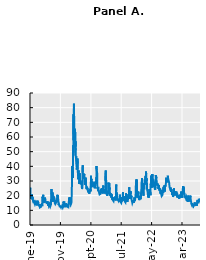
| Category | 25.42 |
|---|---|
| 2019-01-02 | 23.22 |
| 2019-01-03 | 25.45 |
| 2019-01-04 | 21.38 |
| 2019-01-07 | 21.4 |
| 2019-01-08 | 20.47 |
| 2019-01-09 | 19.98 |
| 2019-01-10 | 19.5 |
| 2019-01-11 | 18.19 |
| 2019-01-14 | 19.07 |
| 2019-01-15 | 18.6 |
| 2019-01-16 | 19.04 |
| 2019-01-17 | 18.06 |
| 2019-01-18 | 17.8 |
| 2019-01-21 | 17.8 |
| 2019-01-22 | 20.8 |
| 2019-01-23 | 19.52 |
| 2019-01-24 | 18.89 |
| 2019-01-25 | 17.42 |
| 2019-01-28 | 18.87 |
| 2019-01-29 | 19.13 |
| 2019-01-30 | 17.66 |
| 2019-01-31 | 16.57 |
| 2019-02-01 | 16.14 |
| 2019-02-04 | 15.73 |
| 2019-02-05 | 15.57 |
| 2019-02-06 | 15.38 |
| 2019-02-07 | 16.37 |
| 2019-02-08 | 15.72 |
| 2019-02-11 | 15.97 |
| 2019-02-12 | 15.43 |
| 2019-02-13 | 15.65 |
| 2019-02-14 | 16.22 |
| 2019-02-15 | 14.91 |
| 2019-02-18 | 14.91 |
| 2019-02-19 | 14.88 |
| 2019-02-20 | 14.02 |
| 2019-02-21 | 14.46 |
| 2019-02-22 | 13.51 |
| 2019-02-25 | 14.85 |
| 2019-02-26 | 15.17 |
| 2019-02-27 | 14.7 |
| 2019-02-28 | 14.78 |
| 2019-03-01 | 13.57 |
| 2019-03-04 | 14.63 |
| 2019-03-05 | 14.74 |
| 2019-03-06 | 15.74 |
| 2019-03-07 | 16.59 |
| 2019-03-08 | 16.05 |
| 2019-03-11 | 14.33 |
| 2019-03-12 | 13.77 |
| 2019-03-13 | 13.41 |
| 2019-03-14 | 13.5 |
| 2019-03-15 | 12.88 |
| 2019-03-18 | 13.1 |
| 2019-03-19 | 13.56 |
| 2019-03-20 | 13.91 |
| 2019-03-21 | 13.63 |
| 2019-03-22 | 16.48 |
| 2019-03-25 | 16.33 |
| 2019-03-26 | 14.68 |
| 2019-03-27 | 15.15 |
| 2019-03-28 | 14.43 |
| 2019-03-29 | 13.71 |
| 2019-04-01 | 13.4 |
| 2019-04-02 | 13.36 |
| 2019-04-03 | 13.74 |
| 2019-04-04 | 13.58 |
| 2019-04-05 | 12.82 |
| 2019-04-08 | 13.18 |
| 2019-04-09 | 14.28 |
| 2019-04-10 | 13.3 |
| 2019-04-11 | 13.02 |
| 2019-04-12 | 12.01 |
| 2019-04-15 | 12.32 |
| 2019-04-16 | 12.18 |
| 2019-04-17 | 12.6 |
| 2019-04-18 | 12.09 |
| 2019-04-19 | 12.09 |
| 2019-04-22 | 12.42 |
| 2019-04-23 | 12.28 |
| 2019-04-24 | 13.14 |
| 2019-04-25 | 13.25 |
| 2019-04-26 | 12.73 |
| 2019-04-29 | 13.11 |
| 2019-04-30 | 13.12 |
| 2019-05-01 | 14.8 |
| 2019-05-02 | 14.42 |
| 2019-05-03 | 12.87 |
| 2019-05-06 | 15.44 |
| 2019-05-07 | 19.32 |
| 2019-05-08 | 19.4 |
| 2019-05-09 | 19.1 |
| 2019-05-10 | 16.04 |
| 2019-05-13 | 20.55 |
| 2019-05-14 | 18.06 |
| 2019-05-15 | 16.44 |
| 2019-05-16 | 15.29 |
| 2019-05-17 | 15.96 |
| 2019-05-20 | 16.31 |
| 2019-05-21 | 14.95 |
| 2019-05-22 | 14.75 |
| 2019-05-23 | 16.92 |
| 2019-05-24 | 15.85 |
| 2019-05-27 | 15.85 |
| 2019-05-28 | 17.5 |
| 2019-05-29 | 17.9 |
| 2019-05-30 | 17.3 |
| 2019-05-31 | 18.71 |
| 2019-06-03 | 18.86 |
| 2019-06-04 | 16.97 |
| 2019-06-05 | 16.09 |
| 2019-06-06 | 15.93 |
| 2019-06-07 | 16.3 |
| 2019-06-10 | 15.94 |
| 2019-06-11 | 15.99 |
| 2019-06-12 | 15.91 |
| 2019-06-13 | 15.82 |
| 2019-06-14 | 15.28 |
| 2019-06-17 | 15.35 |
| 2019-06-18 | 15.15 |
| 2019-06-19 | 14.33 |
| 2019-06-20 | 14.75 |
| 2019-06-21 | 15.4 |
| 2019-06-24 | 15.26 |
| 2019-06-25 | 16.28 |
| 2019-06-26 | 16.21 |
| 2019-06-27 | 15.82 |
| 2019-06-28 | 15.08 |
| 2019-07-01 | 14.06 |
| 2019-07-02 | 12.93 |
| 2019-07-03 | 12.57 |
| 2019-07-04 | 12.57 |
| 2019-07-05 | 13.28 |
| 2019-07-08 | 13.96 |
| 2019-07-09 | 14.09 |
| 2019-07-10 | 13.03 |
| 2019-07-11 | 12.93 |
| 2019-07-12 | 12.39 |
| 2019-07-15 | 12.68 |
| 2019-07-16 | 12.86 |
| 2019-07-17 | 13.97 |
| 2019-07-18 | 13.53 |
| 2019-07-19 | 14.45 |
| 2019-07-22 | 13.53 |
| 2019-07-23 | 12.61 |
| 2019-07-24 | 12.07 |
| 2019-07-25 | 12.74 |
| 2019-07-26 | 12.16 |
| 2019-07-29 | 12.83 |
| 2019-07-30 | 13.94 |
| 2019-07-31 | 16.12 |
| 2019-08-01 | 17.87 |
| 2019-08-02 | 17.61 |
| 2019-08-05 | 24.59 |
| 2019-08-06 | 20.17 |
| 2019-08-07 | 19.49 |
| 2019-08-08 | 16.91 |
| 2019-08-09 | 17.97 |
| 2019-08-12 | 21.09 |
| 2019-08-13 | 17.52 |
| 2019-08-14 | 22.1 |
| 2019-08-15 | 21.18 |
| 2019-08-16 | 18.47 |
| 2019-08-19 | 16.88 |
| 2019-08-20 | 17.5 |
| 2019-08-21 | 15.8 |
| 2019-08-22 | 16.68 |
| 2019-08-23 | 19.87 |
| 2019-08-26 | 19.32 |
| 2019-08-27 | 20.31 |
| 2019-08-28 | 19.35 |
| 2019-08-29 | 17.88 |
| 2019-08-30 | 18.98 |
| 2019-09-02 | 18.98 |
| 2019-09-03 | 19.66 |
| 2019-09-04 | 17.33 |
| 2019-09-05 | 16.27 |
| 2019-09-06 | 15 |
| 2019-09-09 | 15.27 |
| 2019-09-10 | 15.2 |
| 2019-09-11 | 14.61 |
| 2019-09-12 | 14.22 |
| 2019-09-13 | 13.74 |
| 2019-09-16 | 14.67 |
| 2019-09-17 | 14.44 |
| 2019-09-18 | 13.95 |
| 2019-09-19 | 14.05 |
| 2019-09-20 | 15.32 |
| 2019-09-23 | 14.91 |
| 2019-09-24 | 17.05 |
| 2019-09-25 | 15.96 |
| 2019-09-26 | 16.07 |
| 2019-09-27 | 17.22 |
| 2019-09-30 | 16.24 |
| 2019-10-01 | 18.56 |
| 2019-10-02 | 20.56 |
| 2019-10-03 | 19.12 |
| 2019-10-04 | 17.04 |
| 2019-10-07 | 17.86 |
| 2019-10-08 | 20.28 |
| 2019-10-09 | 18.64 |
| 2019-10-10 | 17.57 |
| 2019-10-11 | 15.58 |
| 2019-10-14 | 14.57 |
| 2019-10-15 | 13.54 |
| 2019-10-16 | 13.68 |
| 2019-10-17 | 13.79 |
| 2019-10-18 | 14.25 |
| 2019-10-21 | 14 |
| 2019-10-22 | 14.46 |
| 2019-10-23 | 14.01 |
| 2019-10-24 | 13.71 |
| 2019-10-25 | 12.65 |
| 2019-10-28 | 13.11 |
| 2019-10-29 | 13.2 |
| 2019-10-30 | 12.33 |
| 2019-10-31 | 13.22 |
| 2019-11-01 | 12.3 |
| 2019-11-04 | 12.83 |
| 2019-11-05 | 13.1 |
| 2019-11-06 | 12.62 |
| 2019-11-07 | 12.73 |
| 2019-11-08 | 12.07 |
| 2019-11-11 | 12.69 |
| 2019-11-12 | 12.68 |
| 2019-11-13 | 13 |
| 2019-11-14 | 13.05 |
| 2019-11-15 | 12.05 |
| 2019-11-18 | 12.46 |
| 2019-11-19 | 12.86 |
| 2019-11-20 | 12.78 |
| 2019-11-21 | 13.13 |
| 2019-11-22 | 12.34 |
| 2019-11-25 | 11.87 |
| 2019-11-26 | 11.54 |
| 2019-11-27 | 11.75 |
| 2019-11-28 | 11.75 |
| 2019-11-29 | 12.62 |
| 2019-12-02 | 14.91 |
| 2019-12-03 | 15.96 |
| 2019-12-04 | 14.8 |
| 2019-12-05 | 14.52 |
| 2019-12-06 | 13.62 |
| 2019-12-09 | 15.86 |
| 2019-12-10 | 15.68 |
| 2019-12-11 | 14.99 |
| 2019-12-12 | 13.94 |
| 2019-12-13 | 12.63 |
| 2019-12-16 | 12.14 |
| 2019-12-17 | 12.29 |
| 2019-12-18 | 12.58 |
| 2019-12-19 | 12.5 |
| 2019-12-20 | 12.51 |
| 2019-12-23 | 12.61 |
| 2019-12-24 | 12.67 |
| 2019-12-25 | 12.67 |
| 2019-12-26 | 12.65 |
| 2019-12-27 | 13.43 |
| 2019-12-30 | 14.82 |
| 2019-12-31 | 13.78 |
| 2020-01-01 | 13.78 |
| 2020-01-02 | 12.47 |
| 2020-01-03 | 14.02 |
| 2020-01-06 | 13.85 |
| 2020-01-07 | 13.79 |
| 2020-01-08 | 13.45 |
| 2020-01-09 | 12.54 |
| 2020-01-10 | 12.56 |
| 2020-01-13 | 12.32 |
| 2020-01-14 | 12.39 |
| 2020-01-15 | 12.42 |
| 2020-01-16 | 12.32 |
| 2020-01-17 | 12.1 |
| 2020-01-20 | 12.1 |
| 2020-01-21 | 12.85 |
| 2020-01-22 | 12.91 |
| 2020-01-23 | 12.98 |
| 2020-01-24 | 14.56 |
| 2020-01-27 | 18.23 |
| 2020-01-28 | 16.28 |
| 2020-01-29 | 16.39 |
| 2020-01-30 | 15.49 |
| 2020-01-31 | 18.84 |
| 2020-02-03 | 17.97 |
| 2020-02-04 | 16.05 |
| 2020-02-05 | 15.15 |
| 2020-02-06 | 14.96 |
| 2020-02-07 | 15.47 |
| 2020-02-10 | 15.04 |
| 2020-02-11 | 15.18 |
| 2020-02-12 | 13.74 |
| 2020-02-13 | 14.15 |
| 2020-02-14 | 13.68 |
| 2020-02-17 | 13.68 |
| 2020-02-18 | 14.83 |
| 2020-02-19 | 14.38 |
| 2020-02-20 | 15.56 |
| 2020-02-21 | 17.08 |
| 2020-02-24 | 25.03 |
| 2020-02-25 | 27.85 |
| 2020-02-26 | 27.56 |
| 2020-02-27 | 39.16 |
| 2020-02-28 | 40.11 |
| 2020-03-02 | 33.42 |
| 2020-03-03 | 36.82 |
| 2020-03-04 | 31.99 |
| 2020-03-05 | 39.62 |
| 2020-03-06 | 41.94 |
| 2020-03-09 | 54.46 |
| 2020-03-10 | 47.3 |
| 2020-03-11 | 53.9 |
| 2020-03-12 | 75.47 |
| 2020-03-13 | 57.83 |
| 2020-03-16 | 82.69 |
| 2020-03-17 | 75.91 |
| 2020-03-18 | 76.45 |
| 2020-03-19 | 72 |
| 2020-03-20 | 66.04 |
| 2020-03-23 | 61.59 |
| 2020-03-24 | 61.67 |
| 2020-03-25 | 63.95 |
| 2020-03-26 | 61 |
| 2020-03-27 | 65.54 |
| 2020-03-30 | 57.08 |
| 2020-03-31 | 53.54 |
| 2020-04-01 | 57.06 |
| 2020-04-02 | 50.91 |
| 2020-04-03 | 46.8 |
| 2020-04-06 | 45.24 |
| 2020-04-07 | 46.7 |
| 2020-04-08 | 43.35 |
| 2020-04-09 | 41.67 |
| 2020-04-10 | 41.67 |
| 2020-04-13 | 41.17 |
| 2020-04-14 | 37.76 |
| 2020-04-15 | 40.84 |
| 2020-04-16 | 40.11 |
| 2020-04-17 | 38.15 |
| 2020-04-20 | 43.83 |
| 2020-04-21 | 45.41 |
| 2020-04-22 | 41.98 |
| 2020-04-23 | 41.38 |
| 2020-04-24 | 35.93 |
| 2020-04-27 | 33.29 |
| 2020-04-28 | 33.57 |
| 2020-04-29 | 31.23 |
| 2020-04-30 | 34.15 |
| 2020-05-01 | 37.19 |
| 2020-05-04 | 35.97 |
| 2020-05-05 | 33.61 |
| 2020-05-06 | 34.12 |
| 2020-05-07 | 31.44 |
| 2020-05-08 | 27.98 |
| 2020-05-11 | 27.57 |
| 2020-05-12 | 33.04 |
| 2020-05-13 | 35.28 |
| 2020-05-14 | 32.61 |
| 2020-05-15 | 31.89 |
| 2020-05-18 | 29.3 |
| 2020-05-19 | 30.53 |
| 2020-05-20 | 27.99 |
| 2020-05-21 | 29.53 |
| 2020-05-22 | 28.16 |
| 2020-05-25 | 28.16 |
| 2020-05-26 | 28.01 |
| 2020-05-27 | 27.62 |
| 2020-05-28 | 28.59 |
| 2020-05-29 | 27.51 |
| 2020-06-01 | 28.23 |
| 2020-06-02 | 26.84 |
| 2020-06-03 | 25.66 |
| 2020-06-04 | 25.81 |
| 2020-06-05 | 24.52 |
| 2020-06-08 | 25.81 |
| 2020-06-09 | 27.57 |
| 2020-06-10 | 27.57 |
| 2020-06-11 | 40.79 |
| 2020-06-12 | 36.09 |
| 2020-06-15 | 34.4 |
| 2020-06-16 | 33.67 |
| 2020-06-17 | 33.47 |
| 2020-06-18 | 32.94 |
| 2020-06-19 | 35.12 |
| 2020-06-22 | 31.77 |
| 2020-06-23 | 31.37 |
| 2020-06-24 | 33.84 |
| 2020-06-25 | 32.22 |
| 2020-06-26 | 34.73 |
| 2020-06-29 | 31.78 |
| 2020-06-30 | 30.43 |
| 2020-07-01 | 28.62 |
| 2020-07-02 | 27.68 |
| 2020-07-03 | 27.68 |
| 2020-07-06 | 27.94 |
| 2020-07-07 | 29.43 |
| 2020-07-08 | 28.08 |
| 2020-07-09 | 29.26 |
| 2020-07-10 | 27.29 |
| 2020-07-13 | 32.19 |
| 2020-07-14 | 29.52 |
| 2020-07-15 | 27.76 |
| 2020-07-16 | 28 |
| 2020-07-17 | 25.68 |
| 2020-07-20 | 24.46 |
| 2020-07-21 | 24.84 |
| 2020-07-22 | 24.32 |
| 2020-07-23 | 26.08 |
| 2020-07-24 | 25.84 |
| 2020-07-27 | 24.74 |
| 2020-07-28 | 25.44 |
| 2020-07-29 | 24.1 |
| 2020-07-30 | 24.76 |
| 2020-07-31 | 24.46 |
| 2020-08-03 | 24.28 |
| 2020-08-04 | 23.76 |
| 2020-08-05 | 22.99 |
| 2020-08-06 | 22.65 |
| 2020-08-07 | 22.21 |
| 2020-08-10 | 22.13 |
| 2020-08-11 | 24.03 |
| 2020-08-12 | 22.28 |
| 2020-08-13 | 22.13 |
| 2020-08-14 | 22.05 |
| 2020-08-17 | 21.35 |
| 2020-08-18 | 21.51 |
| 2020-08-19 | 22.54 |
| 2020-08-20 | 22.72 |
| 2020-08-21 | 22.54 |
| 2020-08-24 | 22.37 |
| 2020-08-25 | 22.03 |
| 2020-08-26 | 23.27 |
| 2020-08-27 | 24.47 |
| 2020-08-28 | 22.96 |
| 2020-08-31 | 26.41 |
| 2020-09-01 | 26.12 |
| 2020-09-02 | 26.57 |
| 2020-09-03 | 33.6 |
| 2020-09-04 | 30.75 |
| 2020-09-07 | 30.75 |
| 2020-09-08 | 31.46 |
| 2020-09-09 | 28.81 |
| 2020-09-10 | 29.71 |
| 2020-09-11 | 26.87 |
| 2020-09-14 | 25.85 |
| 2020-09-15 | 25.59 |
| 2020-09-16 | 26.04 |
| 2020-09-17 | 26.46 |
| 2020-09-18 | 25.83 |
| 2020-09-21 | 27.78 |
| 2020-09-22 | 26.86 |
| 2020-09-23 | 28.58 |
| 2020-09-24 | 28.51 |
| 2020-09-25 | 26.38 |
| 2020-09-28 | 26.19 |
| 2020-09-29 | 26.27 |
| 2020-09-30 | 26.37 |
| 2020-10-01 | 26.7 |
| 2020-10-02 | 27.63 |
| 2020-10-05 | 27.96 |
| 2020-10-06 | 29.48 |
| 2020-10-07 | 28.06 |
| 2020-10-08 | 26.36 |
| 2020-10-09 | 25 |
| 2020-10-12 | 25.07 |
| 2020-10-13 | 26.07 |
| 2020-10-14 | 26.4 |
| 2020-10-15 | 26.97 |
| 2020-10-16 | 27.41 |
| 2020-10-19 | 29.18 |
| 2020-10-20 | 29.35 |
| 2020-10-21 | 28.65 |
| 2020-10-22 | 28.11 |
| 2020-10-23 | 27.55 |
| 2020-10-26 | 32.46 |
| 2020-10-27 | 33.35 |
| 2020-10-28 | 40.28 |
| 2020-10-29 | 37.59 |
| 2020-10-30 | 38.02 |
| 2020-11-02 | 37.13 |
| 2020-11-03 | 35.55 |
| 2020-11-04 | 29.57 |
| 2020-11-05 | 27.58 |
| 2020-11-06 | 24.86 |
| 2020-11-09 | 25.75 |
| 2020-11-10 | 24.8 |
| 2020-11-11 | 23.45 |
| 2020-11-12 | 25.35 |
| 2020-11-13 | 23.1 |
| 2020-11-16 | 22.45 |
| 2020-11-17 | 22.71 |
| 2020-11-18 | 23.84 |
| 2020-11-19 | 23.11 |
| 2020-11-20 | 23.7 |
| 2020-11-23 | 22.66 |
| 2020-11-24 | 21.64 |
| 2020-11-25 | 21.25 |
| 2020-11-26 | 21.25 |
| 2020-11-27 | 20.84 |
| 2020-11-30 | 20.57 |
| 2020-12-01 | 20.77 |
| 2020-12-02 | 21.17 |
| 2020-12-03 | 21.28 |
| 2020-12-04 | 20.79 |
| 2020-12-07 | 21.3 |
| 2020-12-08 | 20.68 |
| 2020-12-09 | 22.27 |
| 2020-12-10 | 22.52 |
| 2020-12-11 | 23.31 |
| 2020-12-14 | 24.72 |
| 2020-12-15 | 22.89 |
| 2020-12-16 | 22.5 |
| 2020-12-17 | 21.93 |
| 2020-12-18 | 21.57 |
| 2020-12-21 | 25.16 |
| 2020-12-22 | 24.23 |
| 2020-12-23 | 23.31 |
| 2020-12-24 | 21.53 |
| 2020-12-25 | 21.53 |
| 2020-12-28 | 21.7 |
| 2020-12-29 | 23.08 |
| 2020-12-30 | 22.77 |
| 2020-12-31 | 22.75 |
| 2021-01-01 | 22.75 |
| 2021-01-04 | 26.97 |
| 2021-01-05 | 25.34 |
| 2021-01-06 | 25.07 |
| 2021-01-07 | 22.37 |
| 2021-01-08 | 21.56 |
| 2021-01-11 | 24.08 |
| 2021-01-12 | 23.33 |
| 2021-01-13 | 22.21 |
| 2021-01-14 | 23.25 |
| 2021-01-15 | 24.34 |
| 2021-01-18 | 24.34 |
| 2021-01-19 | 23.24 |
| 2021-01-20 | 21.58 |
| 2021-01-21 | 21.32 |
| 2021-01-22 | 21.91 |
| 2021-01-25 | 23.19 |
| 2021-01-26 | 23.02 |
| 2021-01-27 | 37.21 |
| 2021-01-28 | 30.21 |
| 2021-01-29 | 33.09 |
| 2021-02-01 | 30.24 |
| 2021-02-02 | 25.56 |
| 2021-02-03 | 22.91 |
| 2021-02-04 | 21.77 |
| 2021-02-05 | 20.87 |
| 2021-02-08 | 21.24 |
| 2021-02-09 | 21.63 |
| 2021-02-10 | 21.99 |
| 2021-02-11 | 21.25 |
| 2021-02-12 | 19.97 |
| 2021-02-15 | 19.97 |
| 2021-02-16 | 21.46 |
| 2021-02-17 | 21.5 |
| 2021-02-18 | 22.49 |
| 2021-02-19 | 22.05 |
| 2021-02-22 | 23.45 |
| 2021-02-23 | 23.11 |
| 2021-02-24 | 21.34 |
| 2021-02-25 | 28.89 |
| 2021-02-26 | 27.95 |
| 2021-03-01 | 23.35 |
| 2021-03-02 | 24.1 |
| 2021-03-03 | 26.67 |
| 2021-03-04 | 28.57 |
| 2021-03-05 | 24.66 |
| 2021-03-08 | 25.47 |
| 2021-03-09 | 24.03 |
| 2021-03-10 | 22.56 |
| 2021-03-11 | 21.91 |
| 2021-03-12 | 20.69 |
| 2021-03-15 | 20.03 |
| 2021-03-16 | 19.79 |
| 2021-03-17 | 19.23 |
| 2021-03-18 | 21.58 |
| 2021-03-19 | 20.95 |
| 2021-03-22 | 18.88 |
| 2021-03-23 | 20.3 |
| 2021-03-24 | 21.2 |
| 2021-03-25 | 19.81 |
| 2021-03-26 | 18.86 |
| 2021-03-29 | 20.74 |
| 2021-03-30 | 19.61 |
| 2021-03-31 | 19.4 |
| 2021-04-01 | 17.33 |
| 2021-04-02 | 17.33 |
| 2021-04-05 | 17.91 |
| 2021-04-06 | 18.12 |
| 2021-04-07 | 17.16 |
| 2021-04-08 | 16.95 |
| 2021-04-09 | 16.69 |
| 2021-04-12 | 16.91 |
| 2021-04-13 | 16.65 |
| 2021-04-14 | 16.99 |
| 2021-04-15 | 16.57 |
| 2021-04-16 | 16.25 |
| 2021-04-19 | 17.29 |
| 2021-04-20 | 18.68 |
| 2021-04-21 | 17.5 |
| 2021-04-22 | 18.71 |
| 2021-04-23 | 17.33 |
| 2021-04-26 | 17.64 |
| 2021-04-27 | 17.56 |
| 2021-04-28 | 17.28 |
| 2021-04-29 | 17.61 |
| 2021-04-30 | 18.61 |
| 2021-05-03 | 18.31 |
| 2021-05-04 | 19.48 |
| 2021-05-05 | 19.15 |
| 2021-05-06 | 18.39 |
| 2021-05-07 | 16.69 |
| 2021-05-10 | 19.66 |
| 2021-05-11 | 21.84 |
| 2021-05-12 | 27.59 |
| 2021-05-13 | 23.13 |
| 2021-05-14 | 18.81 |
| 2021-05-17 | 19.72 |
| 2021-05-18 | 21.34 |
| 2021-05-19 | 22.18 |
| 2021-05-20 | 20.67 |
| 2021-05-21 | 20.15 |
| 2021-05-24 | 18.4 |
| 2021-05-25 | 18.84 |
| 2021-05-26 | 17.36 |
| 2021-05-27 | 16.74 |
| 2021-05-28 | 16.76 |
| 2021-05-31 | 16.76 |
| 2021-06-01 | 17.9 |
| 2021-06-02 | 17.48 |
| 2021-06-03 | 18.04 |
| 2021-06-04 | 16.42 |
| 2021-06-07 | 16.42 |
| 2021-06-08 | 17.07 |
| 2021-06-09 | 17.89 |
| 2021-06-10 | 16.1 |
| 2021-06-11 | 15.65 |
| 2021-06-14 | 16.39 |
| 2021-06-15 | 17.02 |
| 2021-06-16 | 18.15 |
| 2021-06-17 | 17.75 |
| 2021-06-18 | 20.7 |
| 2021-06-21 | 17.89 |
| 2021-06-22 | 16.66 |
| 2021-06-23 | 16.32 |
| 2021-06-24 | 15.97 |
| 2021-06-25 | 15.62 |
| 2021-06-28 | 15.76 |
| 2021-06-29 | 16.02 |
| 2021-06-30 | 15.83 |
| 2021-07-01 | 15.48 |
| 2021-07-02 | 15.07 |
| 2021-07-05 | 15.07 |
| 2021-07-06 | 16.44 |
| 2021-07-07 | 16.2 |
| 2021-07-08 | 19 |
| 2021-07-09 | 16.18 |
| 2021-07-12 | 16.17 |
| 2021-07-13 | 17.12 |
| 2021-07-14 | 16.33 |
| 2021-07-15 | 17.01 |
| 2021-07-16 | 18.45 |
| 2021-07-19 | 22.5 |
| 2021-07-20 | 19.73 |
| 2021-07-21 | 17.91 |
| 2021-07-22 | 17.69 |
| 2021-07-23 | 17.2 |
| 2021-07-26 | 17.58 |
| 2021-07-27 | 19.36 |
| 2021-07-28 | 18.31 |
| 2021-07-29 | 17.7 |
| 2021-07-30 | 18.24 |
| 2021-08-02 | 19.46 |
| 2021-08-03 | 18.04 |
| 2021-08-04 | 17.97 |
| 2021-08-05 | 17.28 |
| 2021-08-06 | 16.15 |
| 2021-08-09 | 16.72 |
| 2021-08-10 | 16.79 |
| 2021-08-11 | 16.06 |
| 2021-08-12 | 15.59 |
| 2021-08-13 | 15.45 |
| 2021-08-16 | 16.12 |
| 2021-08-17 | 17.91 |
| 2021-08-18 | 21.57 |
| 2021-08-19 | 21.67 |
| 2021-08-20 | 18.56 |
| 2021-08-23 | 17.15 |
| 2021-08-24 | 17.22 |
| 2021-08-25 | 16.79 |
| 2021-08-26 | 18.84 |
| 2021-08-27 | 16.39 |
| 2021-08-30 | 16.19 |
| 2021-08-31 | 16.48 |
| 2021-09-01 | 16.11 |
| 2021-09-02 | 16.41 |
| 2021-09-03 | 16.41 |
| 2021-09-06 | 16.41 |
| 2021-09-07 | 18.14 |
| 2021-09-08 | 17.96 |
| 2021-09-09 | 18.8 |
| 2021-09-10 | 20.95 |
| 2021-09-13 | 19.37 |
| 2021-09-14 | 19.46 |
| 2021-09-15 | 18.18 |
| 2021-09-16 | 18.69 |
| 2021-09-17 | 20.81 |
| 2021-09-20 | 25.71 |
| 2021-09-21 | 24.36 |
| 2021-09-22 | 20.87 |
| 2021-09-23 | 18.63 |
| 2021-09-24 | 17.75 |
| 2021-09-27 | 18.76 |
| 2021-09-28 | 23.25 |
| 2021-09-29 | 22.56 |
| 2021-09-30 | 23.14 |
| 2021-10-01 | 21.15 |
| 2021-10-04 | 22.96 |
| 2021-10-05 | 21.3 |
| 2021-10-06 | 21 |
| 2021-10-07 | 19.54 |
| 2021-10-08 | 18.77 |
| 2021-10-11 | 20 |
| 2021-10-12 | 19.85 |
| 2021-10-13 | 18.64 |
| 2021-10-14 | 16.86 |
| 2021-10-15 | 16.3 |
| 2021-10-18 | 16.31 |
| 2021-10-19 | 15.7 |
| 2021-10-20 | 15.49 |
| 2021-10-21 | 15.01 |
| 2021-10-22 | 15.43 |
| 2021-10-25 | 15.24 |
| 2021-10-26 | 15.98 |
| 2021-10-27 | 16.98 |
| 2021-10-28 | 16.53 |
| 2021-10-29 | 16.26 |
| 2021-11-01 | 16.41 |
| 2021-11-02 | 16.03 |
| 2021-11-03 | 15.1 |
| 2021-11-04 | 15.44 |
| 2021-11-05 | 16.48 |
| 2021-11-08 | 17.22 |
| 2021-11-09 | 17.78 |
| 2021-11-10 | 18.73 |
| 2021-11-11 | 17.66 |
| 2021-11-12 | 16.29 |
| 2021-11-15 | 16.49 |
| 2021-11-16 | 16.37 |
| 2021-11-17 | 17.11 |
| 2021-11-18 | 17.59 |
| 2021-11-19 | 17.91 |
| 2021-11-22 | 19.17 |
| 2021-11-23 | 19.38 |
| 2021-11-24 | 18.58 |
| 2021-11-25 | 18.58 |
| 2021-11-26 | 28.62 |
| 2021-11-29 | 22.96 |
| 2021-11-30 | 27.19 |
| 2021-12-01 | 31.12 |
| 2021-12-02 | 27.95 |
| 2021-12-03 | 30.67 |
| 2021-12-06 | 27.18 |
| 2021-12-07 | 21.89 |
| 2021-12-08 | 19.9 |
| 2021-12-09 | 21.58 |
| 2021-12-10 | 18.69 |
| 2021-12-13 | 20.31 |
| 2021-12-14 | 21.89 |
| 2021-12-15 | 19.29 |
| 2021-12-16 | 20.57 |
| 2021-12-17 | 21.57 |
| 2021-12-20 | 22.87 |
| 2021-12-21 | 21.01 |
| 2021-12-22 | 18.63 |
| 2021-12-23 | 17.96 |
| 2021-12-24 | 17.96 |
| 2021-12-27 | 17.68 |
| 2021-12-28 | 17.54 |
| 2021-12-29 | 16.95 |
| 2021-12-30 | 17.33 |
| 2021-12-31 | 17.22 |
| 2022-01-03 | 16.6 |
| 2022-01-04 | 16.91 |
| 2022-01-05 | 19.73 |
| 2022-01-06 | 19.61 |
| 2022-01-07 | 18.76 |
| 2022-01-10 | 19.4 |
| 2022-01-11 | 18.41 |
| 2022-01-12 | 17.62 |
| 2022-01-13 | 20.31 |
| 2022-01-14 | 19.19 |
| 2022-01-17 | 19.19 |
| 2022-01-18 | 22.79 |
| 2022-01-19 | 23.85 |
| 2022-01-20 | 25.59 |
| 2022-01-21 | 28.85 |
| 2022-01-24 | 29.9 |
| 2022-01-25 | 31.16 |
| 2022-01-26 | 31.96 |
| 2022-01-27 | 30.49 |
| 2022-01-28 | 27.66 |
| 2022-01-31 | 24.83 |
| 2022-02-01 | 21.96 |
| 2022-02-02 | 22.09 |
| 2022-02-03 | 24.35 |
| 2022-02-04 | 23.22 |
| 2022-02-07 | 22.86 |
| 2022-02-08 | 21.44 |
| 2022-02-09 | 19.96 |
| 2022-02-10 | 23.91 |
| 2022-02-11 | 27.36 |
| 2022-02-14 | 28.33 |
| 2022-02-15 | 25.7 |
| 2022-02-16 | 24.29 |
| 2022-02-17 | 28.11 |
| 2022-02-18 | 27.75 |
| 2022-02-21 | 27.75 |
| 2022-02-22 | 28.81 |
| 2022-02-23 | 31.02 |
| 2022-02-24 | 30.32 |
| 2022-02-25 | 27.59 |
| 2022-02-28 | 30.15 |
| 2022-03-01 | 33.32 |
| 2022-03-02 | 30.74 |
| 2022-03-03 | 30.48 |
| 2022-03-04 | 31.98 |
| 2022-03-07 | 36.45 |
| 2022-03-08 | 35.13 |
| 2022-03-09 | 32.45 |
| 2022-03-10 | 30.23 |
| 2022-03-11 | 30.75 |
| 2022-03-14 | 31.77 |
| 2022-03-15 | 29.83 |
| 2022-03-16 | 26.67 |
| 2022-03-17 | 25.67 |
| 2022-03-18 | 23.87 |
| 2022-03-21 | 23.53 |
| 2022-03-22 | 22.94 |
| 2022-03-23 | 23.57 |
| 2022-03-24 | 21.67 |
| 2022-03-25 | 20.81 |
| 2022-03-28 | 19.63 |
| 2022-03-29 | 18.9 |
| 2022-03-30 | 19.33 |
| 2022-03-31 | 20.56 |
| 2022-04-01 | 19.63 |
| 2022-04-04 | 18.57 |
| 2022-04-05 | 21.03 |
| 2022-04-06 | 22.1 |
| 2022-04-07 | 21.55 |
| 2022-04-08 | 21.16 |
| 2022-04-11 | 24.37 |
| 2022-04-12 | 24.26 |
| 2022-04-13 | 21.82 |
| 2022-04-14 | 22.7 |
| 2022-04-15 | 22.7 |
| 2022-04-18 | 22.17 |
| 2022-04-19 | 21.37 |
| 2022-04-20 | 20.32 |
| 2022-04-21 | 22.68 |
| 2022-04-22 | 28.21 |
| 2022-04-25 | 27.02 |
| 2022-04-26 | 33.52 |
| 2022-04-27 | 31.6 |
| 2022-04-28 | 29.99 |
| 2022-04-29 | 33.4 |
| 2022-05-02 | 32.34 |
| 2022-05-03 | 29.25 |
| 2022-05-04 | 25.42 |
| 2022-05-05 | 31.2 |
| 2022-05-06 | 30.19 |
| 2022-05-09 | 34.75 |
| 2022-05-10 | 32.99 |
| 2022-05-11 | 32.56 |
| 2022-05-12 | 31.77 |
| 2022-05-13 | 28.87 |
| 2022-05-16 | 27.47 |
| 2022-05-17 | 26.1 |
| 2022-05-18 | 30.96 |
| 2022-05-19 | 29.35 |
| 2022-05-20 | 29.43 |
| 2022-05-23 | 28.48 |
| 2022-05-24 | 29.45 |
| 2022-05-25 | 28.37 |
| 2022-05-26 | 27.5 |
| 2022-05-27 | 25.72 |
| 2022-05-30 | 26.54 |
| 2022-05-31 | 26.19 |
| 2022-06-01 | 25.69 |
| 2022-06-02 | 24.72 |
| 2022-06-03 | 24.79 |
| 2022-06-06 | 25.07 |
| 2022-06-07 | 24.02 |
| 2022-06-08 | 23.96 |
| 2022-06-09 | 26.09 |
| 2022-06-10 | 27.75 |
| 2022-06-13 | 34.02 |
| 2022-06-14 | 32.69 |
| 2022-06-15 | 29.62 |
| 2022-06-16 | 32.95 |
| 2022-06-17 | 31.13 |
| 2022-06-20 | 31.03 |
| 2022-06-21 | 30.19 |
| 2022-06-22 | 28.95 |
| 2022-06-23 | 29.05 |
| 2022-06-24 | 27.23 |
| 2022-06-27 | 26.95 |
| 2022-06-28 | 28.36 |
| 2022-06-29 | 28.16 |
| 2022-06-30 | 28.71 |
| 2022-07-01 | 26.7 |
| 2022-07-04 | 27.53 |
| 2022-07-05 | 27.54 |
| 2022-07-06 | 26.73 |
| 2022-07-07 | 26.08 |
| 2022-07-08 | 24.64 |
| 2022-07-11 | 26.17 |
| 2022-07-12 | 27.29 |
| 2022-07-13 | 26.82 |
| 2022-07-14 | 26.4 |
| 2022-07-15 | 24.23 |
| 2022-07-18 | 25.3 |
| 2022-07-19 | 24.5 |
| 2022-07-20 | 23.88 |
| 2022-07-21 | 23.11 |
| 2022-07-22 | 23.03 |
| 2022-07-25 | 23.36 |
| 2022-07-26 | 24.69 |
| 2022-07-27 | 23.24 |
| 2022-07-28 | 22.33 |
| 2022-07-29 | 21.33 |
| 2022-08-01 | 22.84 |
| 2022-08-02 | 23.93 |
| 2022-08-03 | 21.95 |
| 2022-08-04 | 21.44 |
| 2022-08-05 | 21.15 |
| 2022-08-08 | 21.29 |
| 2022-08-09 | 21.77 |
| 2022-08-10 | 19.74 |
| 2022-08-11 | 20.2 |
| 2022-08-12 | 19.53 |
| 2022-08-15 | 19.95 |
| 2022-08-16 | 19.69 |
| 2022-08-17 | 19.9 |
| 2022-08-18 | 19.56 |
| 2022-08-19 | 20.6 |
| 2022-08-22 | 23.8 |
| 2022-08-23 | 24.11 |
| 2022-08-24 | 22.82 |
| 2022-08-25 | 21.78 |
| 2022-08-26 | 25.56 |
| 2022-08-29 | 26.21 |
| 2022-08-30 | 26.21 |
| 2022-08-31 | 25.87 |
| 2022-09-01 | 25.56 |
| 2022-09-02 | 25.47 |
| 2022-09-05 | 25.99 |
| 2022-09-06 | 26.91 |
| 2022-09-07 | 24.64 |
| 2022-09-08 | 23.61 |
| 2022-09-09 | 22.79 |
| 2022-09-12 | 23.87 |
| 2022-09-13 | 27.27 |
| 2022-09-14 | 26.16 |
| 2022-09-15 | 26.27 |
| 2022-09-16 | 26.3 |
| 2022-09-19 | 25.76 |
| 2022-09-20 | 27.16 |
| 2022-09-21 | 27.99 |
| 2022-09-22 | 27.35 |
| 2022-09-23 | 29.92 |
| 2022-09-26 | 32.26 |
| 2022-09-27 | 32.6 |
| 2022-09-28 | 30.18 |
| 2022-09-29 | 31.84 |
| 2022-09-30 | 31.62 |
| 2022-10-03 | 30.1 |
| 2022-10-04 | 29.07 |
| 2022-10-05 | 28.55 |
| 2022-10-06 | 30.52 |
| 2022-10-07 | 31.36 |
| 2022-10-10 | 32.45 |
| 2022-10-11 | 33.63 |
| 2022-10-12 | 33.57 |
| 2022-10-13 | 31.94 |
| 2022-10-14 | 32.02 |
| 2022-10-17 | 31.37 |
| 2022-10-18 | 30.5 |
| 2022-10-19 | 30.76 |
| 2022-10-20 | 29.98 |
| 2022-10-21 | 29.69 |
| 2022-10-24 | 29.85 |
| 2022-10-25 | 28.46 |
| 2022-10-26 | 27.28 |
| 2022-10-27 | 27.39 |
| 2022-10-28 | 25.75 |
| 2022-10-31 | 25.88 |
| 2022-11-01 | 25.81 |
| 2022-11-02 | 25.86 |
| 2022-11-03 | 25.3 |
| 2022-11-04 | 24.55 |
| 2022-11-07 | 24.35 |
| 2022-11-08 | 25.54 |
| 2022-11-09 | 26.09 |
| 2022-11-10 | 23.53 |
| 2022-11-11 | 22.52 |
| 2022-11-14 | 23.73 |
| 2022-11-15 | 24.54 |
| 2022-11-16 | 24.11 |
| 2022-11-17 | 23.93 |
| 2022-11-18 | 23.12 |
| 2022-11-21 | 22.36 |
| 2022-11-22 | 21.29 |
| 2022-11-23 | 20.35 |
| 2022-11-24 | 20.42 |
| 2022-11-25 | 20.5 |
| 2022-11-28 | 22.21 |
| 2022-11-29 | 21.89 |
| 2022-11-30 | 20.58 |
| 2022-12-01 | 19.84 |
| 2022-12-02 | 19.06 |
| 2022-12-05 | 20.75 |
| 2022-12-06 | 22.17 |
| 2022-12-07 | 22.68 |
| 2022-12-08 | 22.29 |
| 2022-12-09 | 22.83 |
| 2022-12-12 | 25 |
| 2022-12-13 | 22.55 |
| 2022-12-14 | 21.14 |
| 2022-12-15 | 22.83 |
| 2022-12-16 | 22.62 |
| 2022-12-19 | 22.42 |
| 2022-12-20 | 21.48 |
| 2022-12-21 | 20.07 |
| 2022-12-22 | 21.97 |
| 2022-12-23 | 20.87 |
| 2022-12-26 | 20.87 |
| 2022-12-27 | 21.65 |
| 2022-12-28 | 22.14 |
| 2022-12-29 | 21.44 |
| 2022-12-30 | 21.67 |
| 2023-01-02 | 21.67 |
| 2023-01-03 | 22.9 |
| 2023-01-04 | 22.01 |
| 2023-01-05 | 22.46 |
| 2023-01-06 | 21.13 |
| 2023-01-09 | 21.97 |
| 2023-01-10 | 20.58 |
| 2023-01-11 | 21.09 |
| 2023-01-12 | 18.83 |
| 2023-01-13 | 18.35 |
| 2023-01-16 | 19.49 |
| 2023-01-17 | 19.36 |
| 2023-01-18 | 20.34 |
| 2023-01-19 | 20.52 |
| 2023-01-20 | 19.85 |
| 2023-01-23 | 19.81 |
| 2023-01-24 | 19.2 |
| 2023-01-25 | 19.08 |
| 2023-01-26 | 18.73 |
| 2023-01-27 | 18.51 |
| 2023-01-30 | 19.94 |
| 2023-01-31 | 19.4 |
| 2023-02-01 | 17.87 |
| 2023-02-02 | 18.73 |
| 2023-02-03 | 18.33 |
| 2023-02-06 | 19.43 |
| 2023-02-07 | 18.66 |
| 2023-02-08 | 19.63 |
| 2023-02-09 | 20.71 |
| 2023-02-10 | 20.53 |
| 2023-02-13 | 20.34 |
| 2023-02-14 | 18.91 |
| 2023-02-15 | 18.23 |
| 2023-02-16 | 20.17 |
| 2023-02-17 | 20.02 |
| 2023-02-20 | 21.23 |
| 2023-02-21 | 22.87 |
| 2023-02-22 | 22.29 |
| 2023-02-23 | 21.14 |
| 2023-02-24 | 21.67 |
| 2023-02-27 | 20.95 |
| 2023-02-28 | 20.7 |
| 2023-03-01 | 20.58 |
| 2023-03-02 | 19.59 |
| 2023-03-03 | 18.49 |
| 2023-03-06 | 18.61 |
| 2023-03-07 | 19.59 |
| 2023-03-08 | 19.11 |
| 2023-03-09 | 22.61 |
| 2023-03-10 | 24.8 |
| 2023-03-13 | 26.52 |
| 2023-03-14 | 23.73 |
| 2023-03-15 | 26.14 |
| 2023-03-16 | 22.99 |
| 2023-03-17 | 25.51 |
| 2023-03-20 | 24.15 |
| 2023-03-21 | 21.38 |
| 2023-03-22 | 22.26 |
| 2023-03-23 | 22.61 |
| 2023-03-24 | 21.74 |
| 2023-03-27 | 20.6 |
| 2023-03-28 | 19.97 |
| 2023-03-29 | 19.12 |
| 2023-03-30 | 19.02 |
| 2023-03-31 | 18.7 |
| 2023-04-03 | 18.55 |
| 2023-04-04 | 19 |
| 2023-04-05 | 19.08 |
| 2023-04-06 | 18.4 |
| 2023-04-07 | 18.4 |
| 2023-04-10 | 18.97 |
| 2023-04-11 | 19.1 |
| 2023-04-12 | 19.09 |
| 2023-04-13 | 17.8 |
| 2023-04-14 | 17.07 |
| 2023-04-17 | 16.95 |
| 2023-04-18 | 16.83 |
| 2023-04-19 | 16.46 |
| 2023-04-20 | 17.17 |
| 2023-04-21 | 16.77 |
| 2023-04-24 | 16.89 |
| 2023-04-25 | 18.76 |
| 2023-04-26 | 18.84 |
| 2023-04-27 | 17.03 |
| 2023-04-28 | 15.78 |
| 2023-05-01 | 16.08 |
| 2023-05-02 | 17.78 |
| 2023-05-03 | 18.34 |
| 2023-05-04 | 20.09 |
| 2023-05-05 | 17.19 |
| 2023-05-08 | 16.98 |
| 2023-05-09 | 17.71 |
| 2023-05-10 | 16.94 |
| 2023-05-11 | 16.93 |
| 2023-05-12 | 17.03 |
| 2023-05-15 | 17.12 |
| 2023-05-16 | 17.99 |
| 2023-05-17 | 16.87 |
| 2023-05-18 | 16.05 |
| 2023-05-19 | 16.81 |
| 2023-05-22 | 17.21 |
| 2023-05-23 | 18.53 |
| 2023-05-24 | 20.03 |
| 2023-05-25 | 19.14 |
| 2023-05-26 | 17.95 |
| 2023-05-29 | 17.46 |
| 2023-05-30 | 17.46 |
| 2023-05-31 | 17.94 |
| 2023-06-01 | 15.65 |
| 2023-06-02 | 14.6 |
| 2023-06-05 | 14.73 |
| 2023-06-06 | 13.96 |
| 2023-06-07 | 13.94 |
| 2023-06-08 | 13.65 |
| 2023-06-09 | 13.83 |
| 2023-06-12 | 15.01 |
| 2023-06-13 | 14.61 |
| 2023-06-14 | 13.88 |
| 2023-06-15 | 14.5 |
| 2023-06-16 | 13.54 |
| 2023-06-19 | 14.19 |
| 2023-06-20 | 13.88 |
| 2023-06-21 | 13.2 |
| 2023-06-22 | 12.91 |
| 2023-06-23 | 13.44 |
| 2023-06-26 | 14.25 |
| 2023-06-27 | 13.74 |
| 2023-06-28 | 13.43 |
| 2023-06-29 | 13.54 |
| 2023-06-30 | 13.59 |
| 2023-07-03 | 13.57 |
| 2023-07-04 | 13.7 |
| 2023-07-05 | 14.18 |
| 2023-07-06 | 15.44 |
| 2023-07-07 | 14.83 |
| 2023-07-10 | 15.07 |
| 2023-07-11 | 14.84 |
| 2023-07-12 | 13.54 |
| 2023-07-13 | 13.61 |
| 2023-07-14 | 13.34 |
| 2023-07-17 | 13.48 |
| 2023-07-18 | 13.3 |
| 2023-07-19 | 13.76 |
| 2023-07-20 | 13.99 |
| 2023-07-21 | 13.6 |
| 2023-07-24 | 13.91 |
| 2023-07-25 | 13.86 |
| 2023-07-26 | 13.19 |
| 2023-07-27 | 14.41 |
| 2023-07-28 | 13.33 |
| 2023-07-31 | 13.63 |
| 2023-08-01 | 13.93 |
| 2023-08-02 | 16.09 |
| 2023-08-03 | 15.92 |
| 2023-08-04 | 17.1 |
| 2023-08-07 | 15.77 |
| 2023-08-08 | 15.99 |
| 2023-08-09 | 15.96 |
| 2023-08-10 | 15.85 |
| 2023-08-11 | 14.84 |
| 2023-08-14 | 14.82 |
| 2023-08-15 | 16.46 |
| 2023-08-16 | 16.78 |
| 2023-08-17 | 17.89 |
| 2023-08-18 | 17.3 |
| 2023-08-21 | 17.13 |
| 2023-08-22 | 16.97 |
| 2023-08-23 | 15.98 |
| 2023-08-24 | 17.2 |
| 2023-08-25 | 15.68 |
| 2023-08-28 | 15.08 |